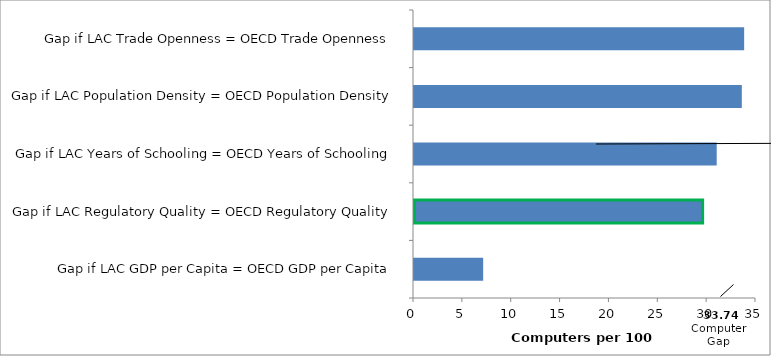
| Category | Series 0 |
|---|---|
| Gap if LAC GDP per Capita = OECD GDP per Capita | 7.18 |
| Gap if LAC Regulatory Quality = OECD Regulatory Quality | 29.64 |
| Gap if LAC Years of Schooling = OECD Years of Schooling | 31.08 |
| Gap if LAC Population Density = OECD Population Density | 33.65 |
| Gap if LAC Trade Openness = OECD Trade Openness | 33.89 |